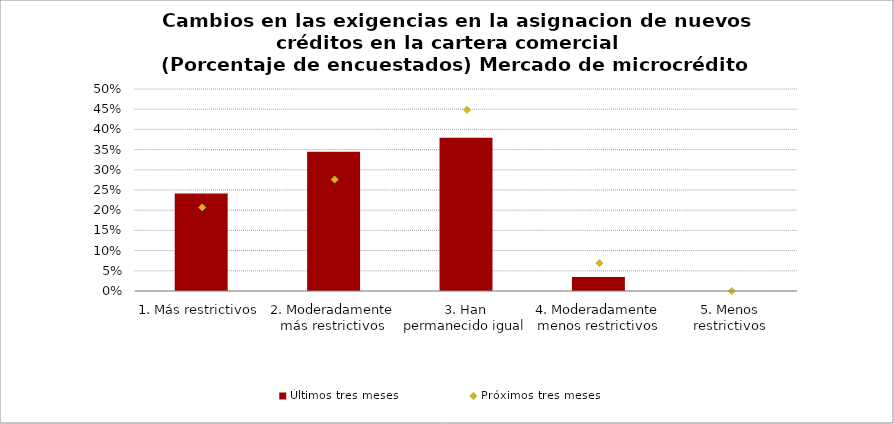
| Category | Últimos tres meses |
|---|---|
| 1. Más restrictivos | 0.241 |
| 2. Moderadamente más restrictivos | 0.345 |
| 3. Han permanecido igual | 0.379 |
| 4. Moderadamente menos restrictivos | 0.034 |
| 5. Menos restrictivos | 0 |